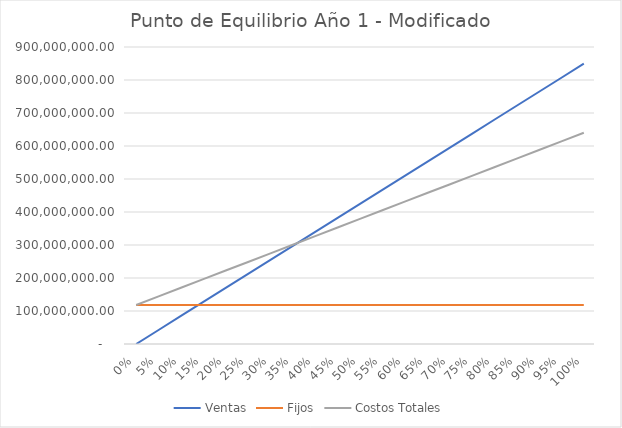
| Category | Ventas | Fijos | Costos Totales |
|---|---|---|---|
| 0.0 | 0 | 118187117.744 | 118187117.744 |
| 0.05 | 42466501 | 118187117.744 | 144281462.273 |
| 0.1 | 84933002 | 118187117.744 | 170375806.802 |
| 0.15 | 127399503 | 118187117.744 | 196470151.331 |
| 0.2 | 169866004 | 118187117.744 | 222564495.861 |
| 0.25 | 212332505 | 118187117.744 | 248658840.39 |
| 0.3 | 254799006 | 118187117.744 | 274753184.919 |
| 0.35 | 297265507 | 118187117.744 | 300847529.448 |
| 0.4 | 339732008 | 118187117.744 | 326941873.977 |
| 0.45 | 382198509 | 118187117.744 | 353036218.506 |
| 0.5 | 424665010 | 118187117.744 | 379130563.036 |
| 0.55 | 467131511 | 118187117.744 | 405224907.565 |
| 0.6 | 509598012 | 118187117.744 | 431319252.094 |
| 0.65 | 552064513 | 118187117.744 | 457413596.623 |
| 0.7 | 594531014 | 118187117.744 | 483507941.152 |
| 0.75 | 636997515 | 118187117.744 | 509602285.682 |
| 0.8 | 679464016 | 118187117.744 | 535696630.211 |
| 0.85 | 721930517 | 118187117.744 | 561790974.74 |
| 0.9 | 764397018 | 118187117.744 | 587885319.269 |
| 0.95 | 806863519 | 118187117.744 | 613979663.798 |
| 1.0 | 849330020 | 118187117.744 | 640074008.327 |